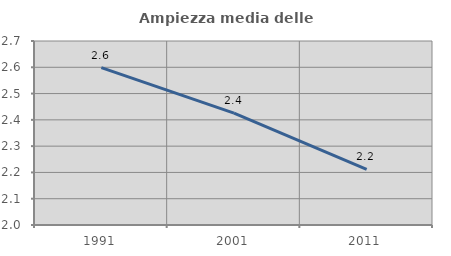
| Category | Ampiezza media delle famiglie |
|---|---|
| 1991.0 | 2.599 |
| 2001.0 | 2.426 |
| 2011.0 | 2.212 |